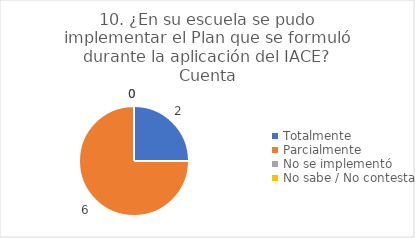
| Category | 10. ¿En su escuela se pudo implementar el Plan que se formuló durante la aplicación del IACE? |
|---|---|
| Totalmente  | 0.25 |
| Parcialmente  | 0.75 |
| No se implementó  | 0 |
| No sabe / No contesta | 0 |